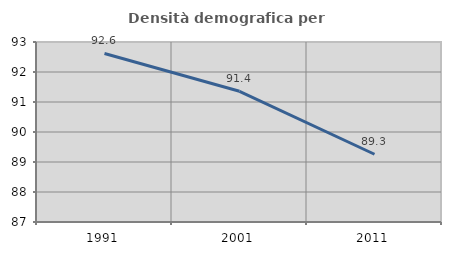
| Category | Densità demografica |
|---|---|
| 1991.0 | 92.619 |
| 2001.0 | 91.357 |
| 2011.0 | 89.258 |